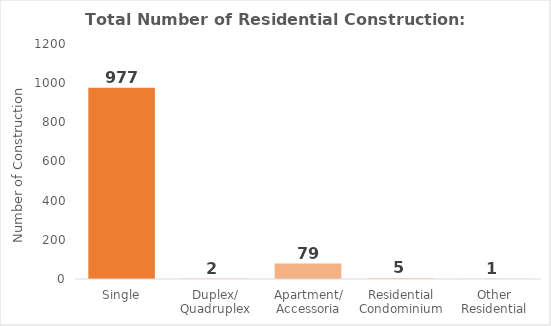
| Category | No |
|---|---|
| Single | 977 |
| Duplex/ Quadruplex | 2 |
| Apartment/ Accessoria | 79 |
| Residential Condominium | 5 |
| Other Residential | 1 |